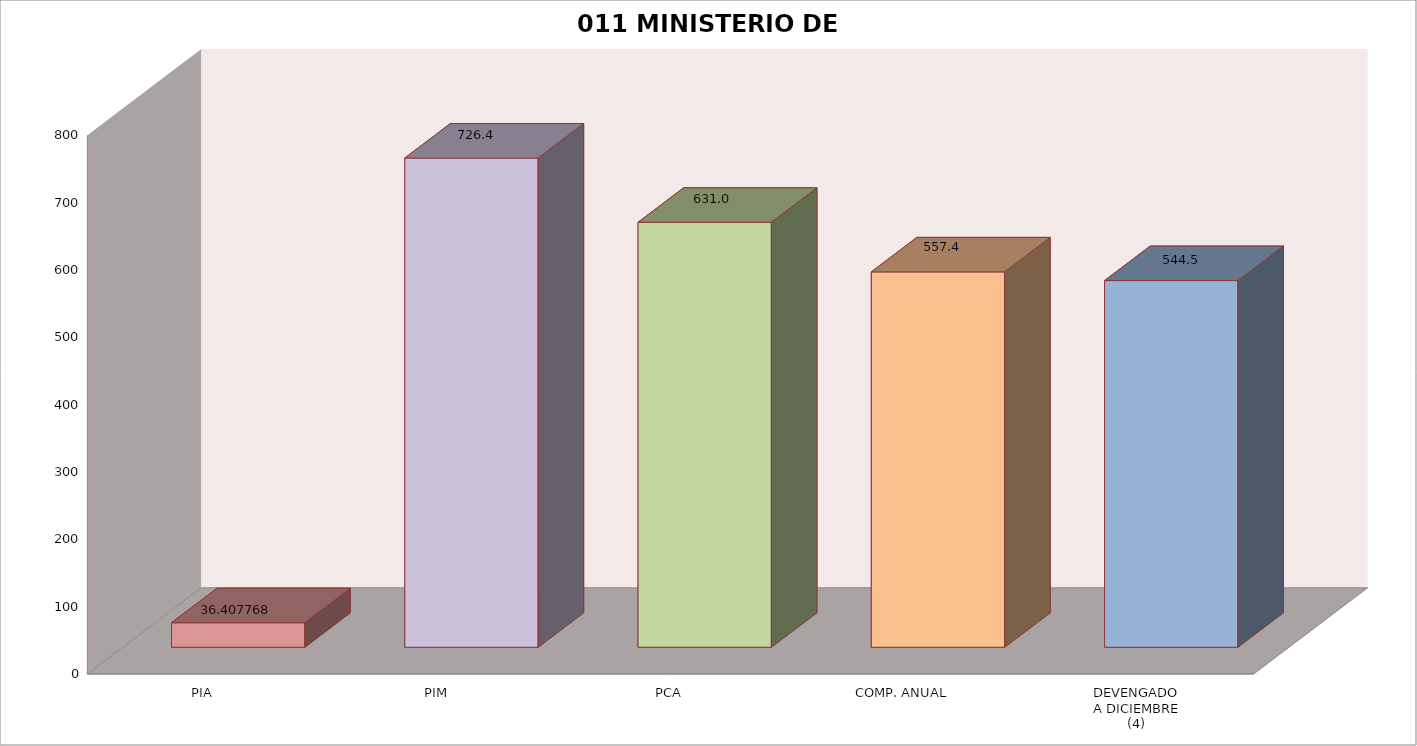
| Category | 011 MINISTERIO DE SALUD |
|---|---|
| PIA | 36.408 |
| PIM | 726.429 |
| PCA | 631.037 |
| COMP. ANUAL | 557.384 |
| DEVENGADO
A DICIEMBRE
(4) | 544.456 |